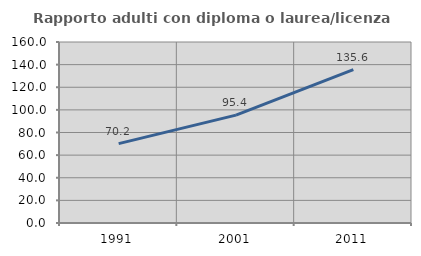
| Category | Rapporto adulti con diploma o laurea/licenza media  |
|---|---|
| 1991.0 | 70.181 |
| 2001.0 | 95.385 |
| 2011.0 | 135.563 |